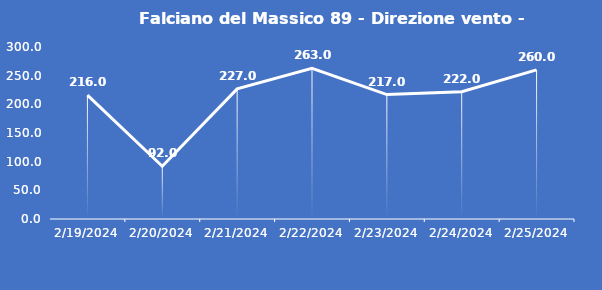
| Category | Falciano del Massico 89 - Direzione vento - Grezzo (°N) |
|---|---|
| 2/19/24 | 216 |
| 2/20/24 | 92 |
| 2/21/24 | 227 |
| 2/22/24 | 263 |
| 2/23/24 | 217 |
| 2/24/24 | 222 |
| 2/25/24 | 260 |